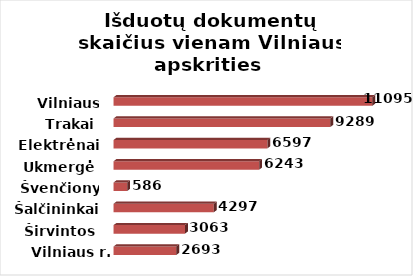
| Category | Series 0 |
|---|---|
| Vilniaus r. | 2692.75 |
| Širvintos | 3063.133 |
| Šalčininkai | 4296.548 |
| Švenčionys | 585.85 |
| Ukmergė | 6242.571 |
| Elektrėnai | 6596.793 |
| Trakai | 9288.528 |
| Vilniaus m. | 11095.052 |